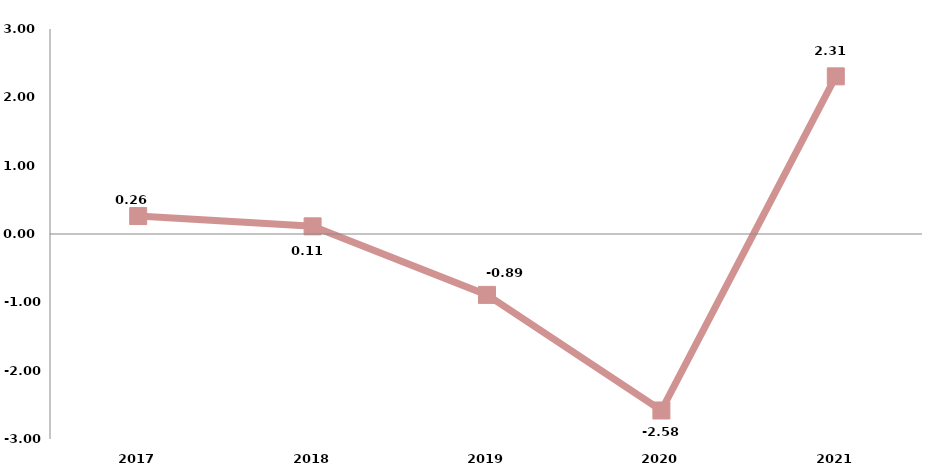
| Category | النسبة المئوية للتغير مقارنة بالسنة السابقة
Rate of change current earipreviouse year  |
|---|---|
| 2017.0 | 0.263 |
| 2018.0 | 0.112 |
| 2019.0 | -0.891 |
| 2020.0 | -2.583 |
| 2021.0 | 2.307 |